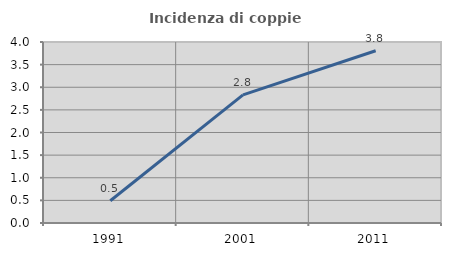
| Category | Incidenza di coppie miste |
|---|---|
| 1991.0 | 0.491 |
| 2001.0 | 2.833 |
| 2011.0 | 3.807 |